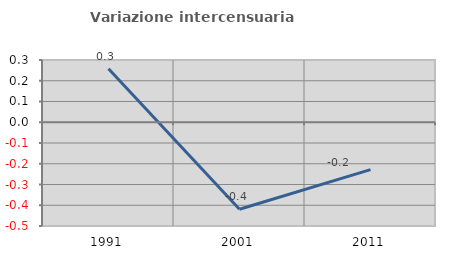
| Category | Variazione intercensuaria annua |
|---|---|
| 1991.0 | 0.258 |
| 2001.0 | -0.42 |
| 2011.0 | -0.228 |